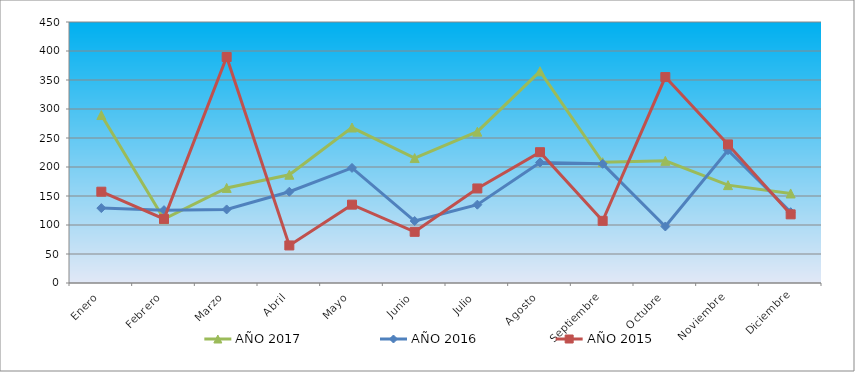
| Category | AÑO 2017 | AÑO 2016 | AÑO 2015 |
|---|---|---|---|
| Enero | 289.591 | 129.154 | 157.427 |
| Febrero | 110.093 | 125.631 | 110.534 |
| Marzo | 163.942 | 126.805 | 389.66 |
| Abril | 186.679 | 157.333 | 64.757 |
| Mayo | 268.051 | 198.427 | 135.097 |
| Junio | 215.399 | 106.845 | 88.204 |
| Julio | 260.872 | 135.024 | 163.01 |
| Agosto | 364.981 | 207.82 | 225.534 |
| Septiembre | 208.219 | 205.472 | 107.184 |
| Octubre | 210.612 | 97.452 | 355.049 |
| Noviembre | 168.729 | 228.954 | 238.932 |
| Diciembre | 154.369 | 122.109 | 118.35 |